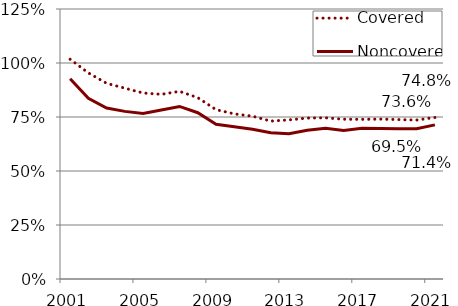
| Category | Covered | Noncovered |
|---|---|---|
| 2001.0 | 1.017 | 0.927 |
| 2002.0 | 0.954 | 0.837 |
| 2003.0 | 0.906 | 0.791 |
| 2004.0 | 0.883 | 0.776 |
| 2005.0 | 0.861 | 0.766 |
| 2006.0 | 0.855 | 0.783 |
| 2007.0 | 0.869 | 0.799 |
| 2008.0 | 0.839 | 0.77 |
| 2009.0 | 0.784 | 0.716 |
| 2010.0 | 0.764 | 0.705 |
| 2011.0 | 0.754 | 0.693 |
| 2012.0 | 0.731 | 0.677 |
| 2013.0 | 0.737 | 0.672 |
| 2014.0 | 0.745 | 0.689 |
| 2015.0 | 0.746 | 0.698 |
| 2016.0 | 0.739 | 0.687 |
| 2017.0 | 0.739 | 0.698 |
| 2018.0 | 0.74 | 0.696 |
| 2019.0 | 0.738 | 0.696 |
| 2020.0 | 0.736 | 0.695 |
| 2021.0 | 0.748 | 0.714 |